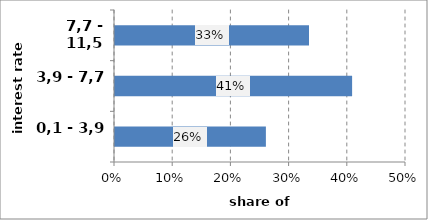
| Category | Series 0 |
|---|---|
| 0,1 - 3,9 | 0.259 |
| 3,9 - 7,7 | 0.407 |
| 7,7 - 11,5 | 0.333 |